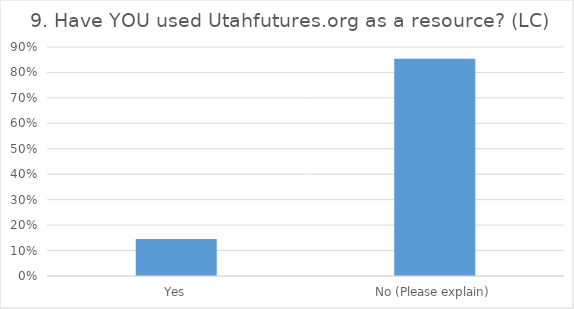
| Category | 9. Have YOU used Utahfutures.org as a resource? (LC) |
|---|---|
| Yes | 0.146 |
| No (Please explain) | 0.854 |